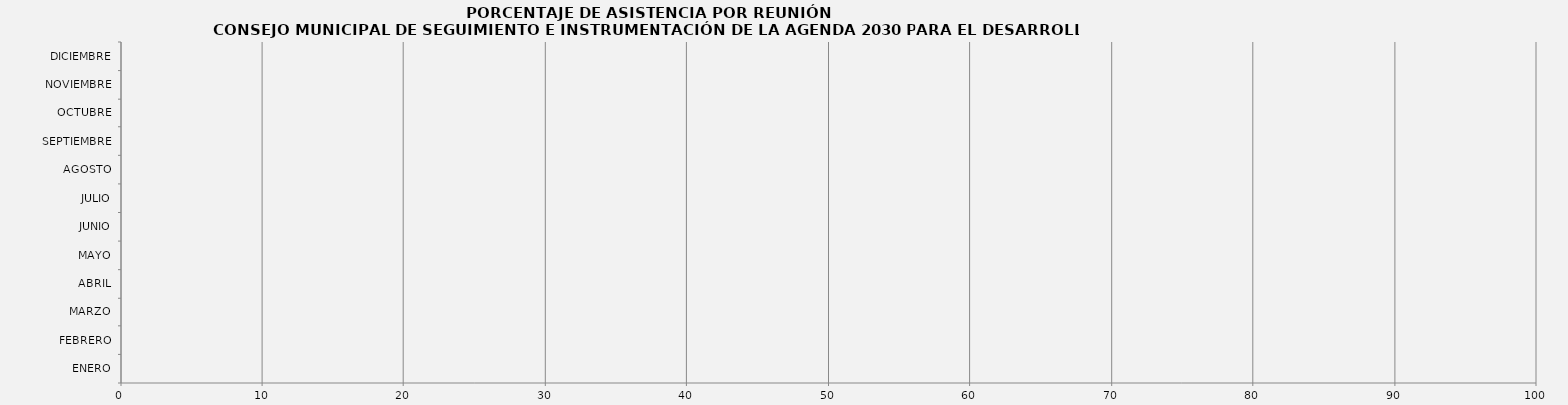
| Category | ENERO |
|---|---|
| ENERO | 0 |
| FEBRERO | 0 |
| MARZO | 0 |
| ABRIL | 0 |
| MAYO | 0 |
| JUNIO | 0 |
| JULIO | 0 |
| AGOSTO | 0 |
| SEPTIEMBRE | 0 |
| OCTUBRE | 0 |
| NOVIEMBRE | 0 |
| DICIEMBRE | 0 |